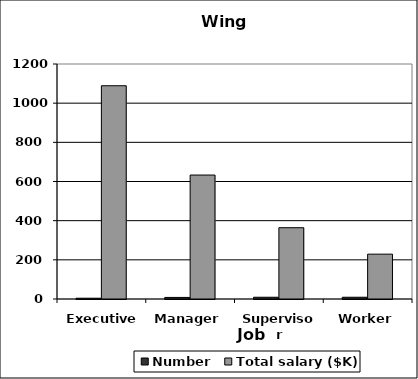
| Category | Number | Total salary ($K) |
|---|---|---|
| Executive | 4 | 1089 |
| Manager | 8 | 633 |
| Supervisor | 9 | 364 |
| Worker | 9 | 229 |